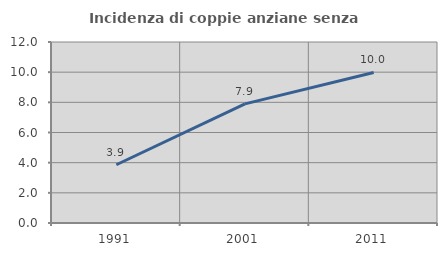
| Category | Incidenza di coppie anziane senza figli  |
|---|---|
| 1991.0 | 3.863 |
| 2001.0 | 7.9 |
| 2011.0 | 9.982 |